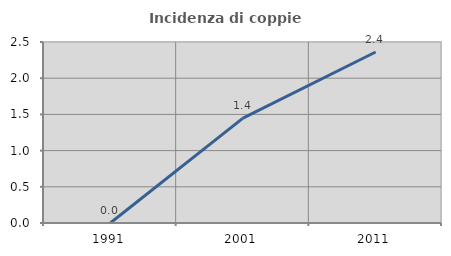
| Category | Incidenza di coppie miste |
|---|---|
| 1991.0 | 0 |
| 2001.0 | 1.449 |
| 2011.0 | 2.362 |